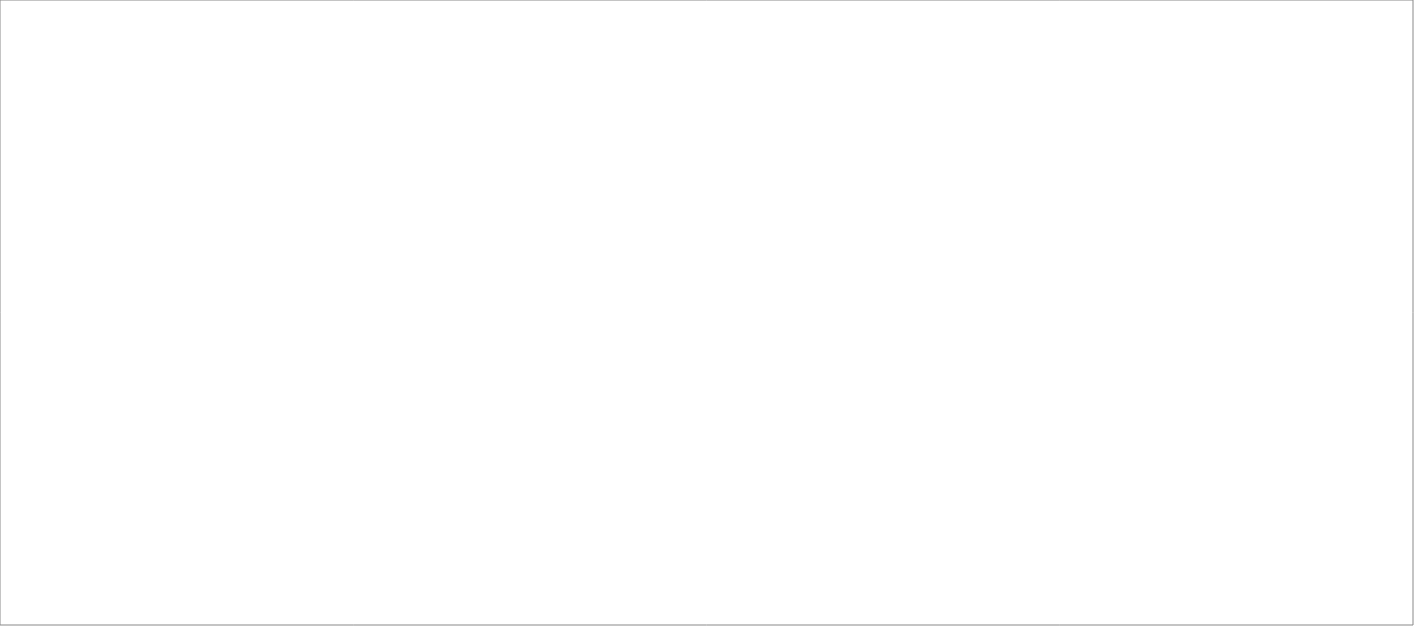
| Category | Total |
|---|---|
| Poolia Sverige AB | 85 |
| Randstad AB | 80 |
| Experis AB | 45 |
| Lisberg Sverige AB | 25 |
| Source Executive Recruitment Sweden AB | 25 |